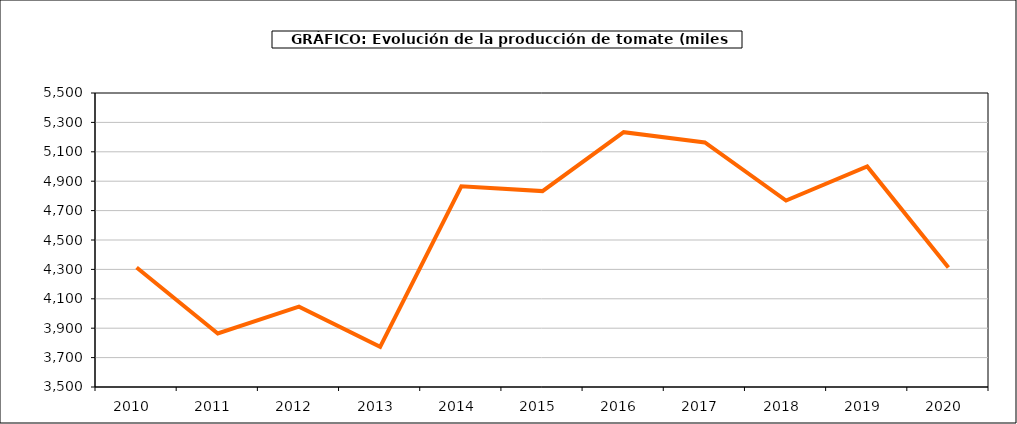
| Category | producción |
|---|---|
| 2010.0 | 4312.709 |
| 2011.0 | 3864.12 |
| 2012.0 | 4046.413 |
| 2013.0 | 3772.846 |
| 2014.0 | 4865.46 |
| 2015.0 | 4832.7 |
| 2016.0 | 5233.542 |
| 2017.0 | 5163.466 |
| 2018.0 | 4768.595 |
| 2019.0 | 5000.559 |
| 2020.0 | 4312.895 |